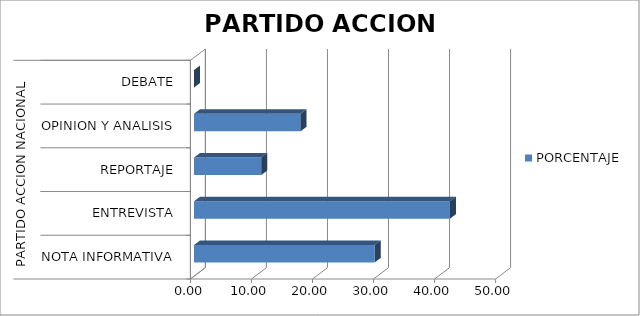
| Category | PORCENTAJE |
|---|---|
| 0 | 29.595 |
| 1 | 41.921 |
| 2 | 11.019 |
| 3 | 17.465 |
| 4 | 0 |